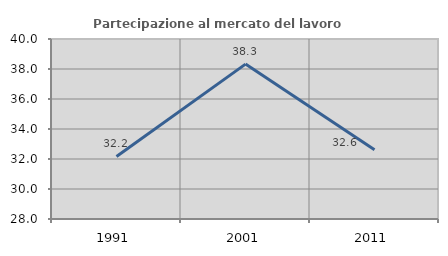
| Category | Partecipazione al mercato del lavoro  femminile |
|---|---|
| 1991.0 | 32.171 |
| 2001.0 | 38.327 |
| 2011.0 | 32.617 |